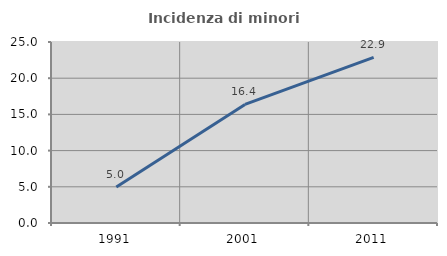
| Category | Incidenza di minori stranieri |
|---|---|
| 1991.0 | 4.959 |
| 2001.0 | 16.378 |
| 2011.0 | 22.874 |